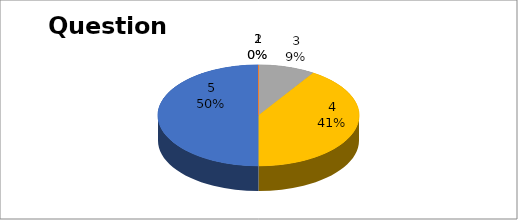
| Category | Series 0 |
|---|---|
| 0 | 0 |
| 1 | 0 |
| 2 | 2 |
| 3 | 9 |
| 4 | 11 |